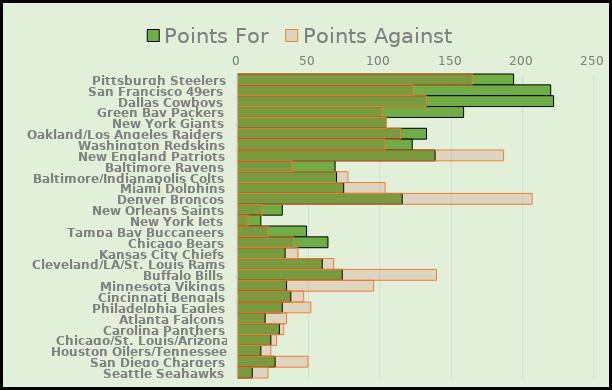
| Category | Points For | Points Against |
|---|---|---|
| Pittsburgh Steelers | 193 | 164 |
| San Francisco 49ers | 219 | 123 |
| Dallas Cowboys | 221 | 132 |
| Green Bay Packers | 158 | 101 |
| New York Giants | 104 | 104 |
| Oakland/Los Angeles Raiders | 132 | 114 |
| Washington Redskins | 122 | 103 |
| New England Patriots | 138 | 186 |
| Baltimore Ravens | 68 | 38 |
| Baltimore/Indianapolis Colts | 69 | 77 |
| Miami Dolphins | 74 | 103 |
| Denver Broncos | 115 | 206 |
| New Orleans Saints | 31 | 17 |
| New York Jets | 16 | 7 |
| Tampa Bay Buccaneers | 48 | 21 |
| Chicago Bears | 63 | 39 |
| Kansas City Chiefs | 33 | 42 |
| Cleveland/LA/St. Louis Rams | 59 | 67 |
| Buffalo Bills | 73 | 139 |
| Minnesota Vikings | 34 | 95 |
| Cincinnati Bengals | 37 | 46 |
| Philadelphia Eagles | 31 | 51 |
| Atlanta Falcons | 19 | 34 |
| Carolina Panthers | 29 | 32 |
| Chicago/St. Louis/Arizona Cardinals | 23 | 27 |
| Houston Oilers/Tennessee Titans | 16 | 23 |
| San Diego Chargers | 26 | 49 |
| Seattle Seahawks | 10 | 21 |